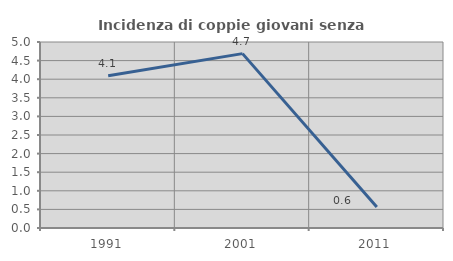
| Category | Incidenza di coppie giovani senza figli |
|---|---|
| 1991.0 | 4.094 |
| 2001.0 | 4.688 |
| 2011.0 | 0.562 |